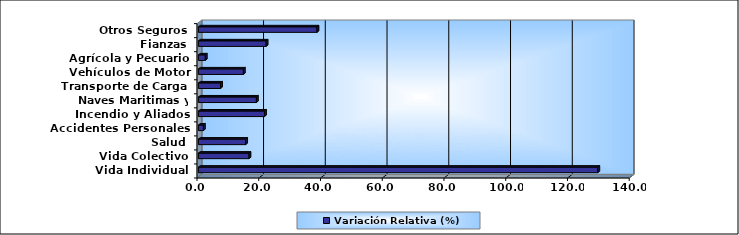
| Category | Variación Relativa (%) |
|---|---|
| Vida Individual | 129.359 |
| Vida Colectivo | 16.367 |
| Salud | 15.289 |
| Accidentes Personales | 1.61 |
| Incendio y Aliados | 21.4 |
| Naves Maritimas y Aéreas | 18.773 |
| Transporte de Carga | 7.166 |
| Vehículos de Motor | 14.553 |
| Agrícola y Pecuario | 2.218 |
| Fianzas | 21.933 |
| Otros Seguros | 38.401 |